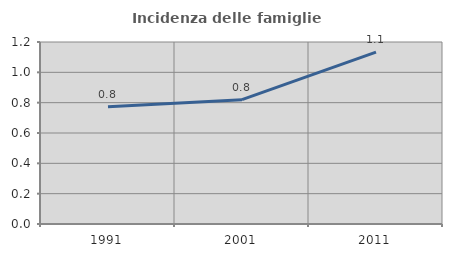
| Category | Incidenza delle famiglie numerose |
|---|---|
| 1991.0 | 0.773 |
| 2001.0 | 0.82 |
| 2011.0 | 1.133 |